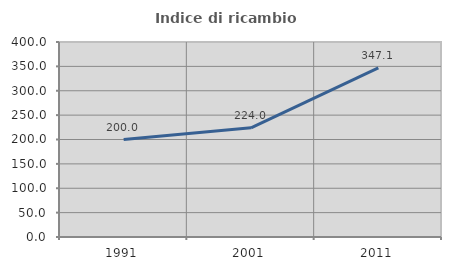
| Category | Indice di ricambio occupazionale  |
|---|---|
| 1991.0 | 200 |
| 2001.0 | 224 |
| 2011.0 | 347.059 |